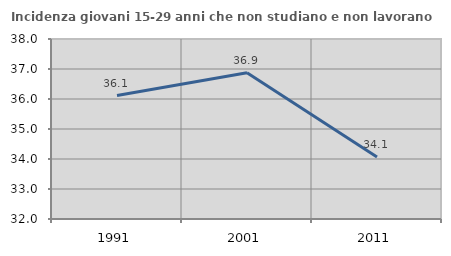
| Category | Incidenza giovani 15-29 anni che non studiano e non lavorano  |
|---|---|
| 1991.0 | 36.116 |
| 2001.0 | 36.875 |
| 2011.0 | 34.069 |